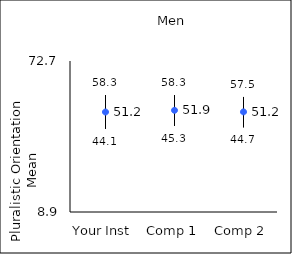
| Category | 25th percentile | 75th percentile | Mean |
|---|---|---|---|
| Your Inst | 44.1 | 58.3 | 51.15 |
| Comp 1 | 45.3 | 58.3 | 51.87 |
| Comp 2 | 44.7 | 57.5 | 51.2 |